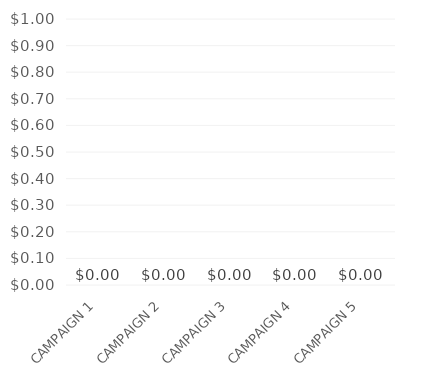
| Category | Series 0 |
|---|---|
| CAMPAIGN 1 | 0 |
| CAMPAIGN 2 | 0 |
| CAMPAIGN 3 | 0 |
| CAMPAIGN 4 | 0 |
| CAMPAIGN 5 | 0 |